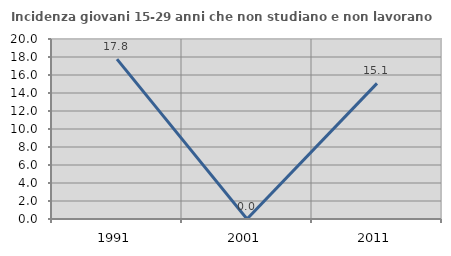
| Category | Incidenza giovani 15-29 anni che non studiano e non lavorano  |
|---|---|
| 1991.0 | 17.766 |
| 2001.0 | 0 |
| 2011.0 | 15.074 |